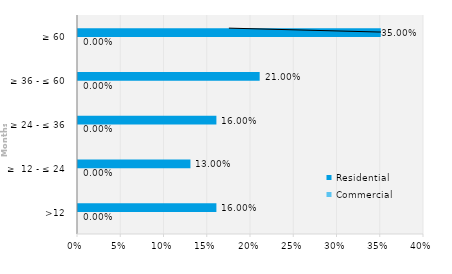
| Category | Commercial | Residential |
|---|---|---|
| >12 | 0 | 0.16 |
| ≥  12 - ≤ 24 | 0 | 0.13 |
| ≥ 24 - ≤ 36 | 0 | 0.16 |
| ≥ 36 - ≤ 60 | 0 | 0.21 |
| ≥ 60 | 0 | 0.35 |